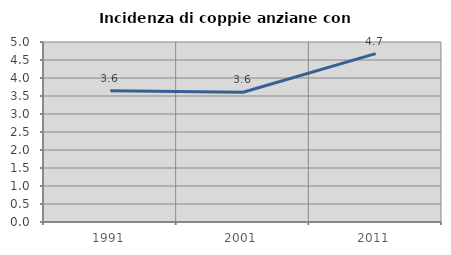
| Category | Incidenza di coppie anziane con figli |
|---|---|
| 1991.0 | 3.647 |
| 2001.0 | 3.604 |
| 2011.0 | 4.678 |